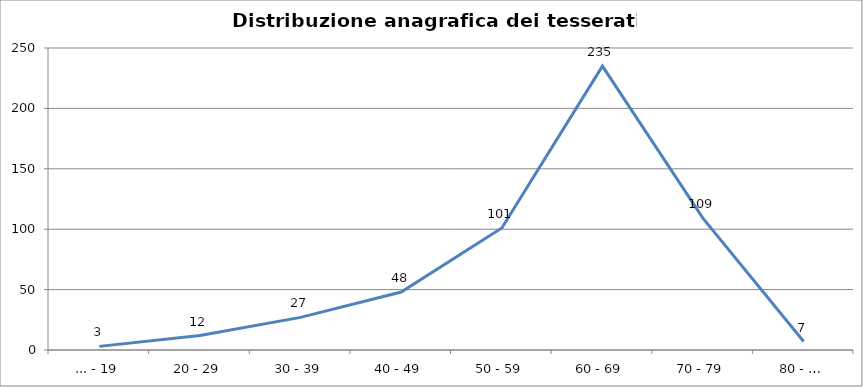
| Category | Nr. Tesserati |
|---|---|
| ... - 19 | 3 |
| 20 - 29 | 12 |
| 30 - 39 | 27 |
| 40 - 49 | 48 |
| 50 - 59 | 101 |
| 60 - 69 | 235 |
| 70 - 79 | 109 |
| 80 - … | 7 |